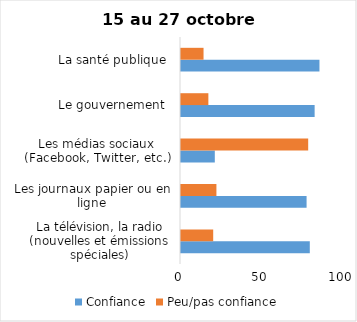
| Category | Confiance | Peu/pas confiance |
|---|---|---|
| La télévision, la radio (nouvelles et émissions spéciales) | 80 | 20 |
| Les journaux papier ou en ligne | 78 | 22 |
| Les médias sociaux (Facebook, Twitter, etc.) | 21 | 79 |
| Le gouvernement  | 83 | 17 |
| La santé publique  | 86 | 14 |